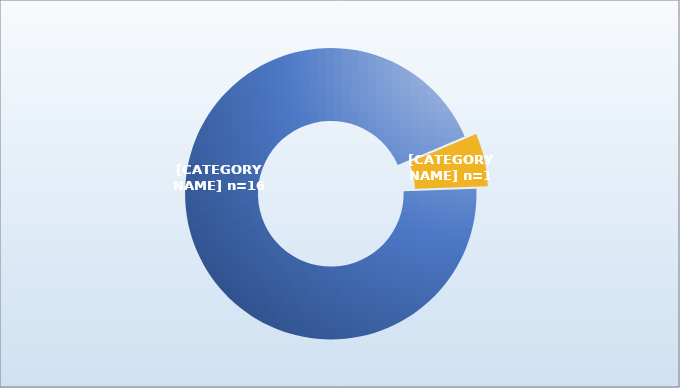
| Category | Percent |
|---|---|
| Public | 0.941 |
| Federal | 0.059 |